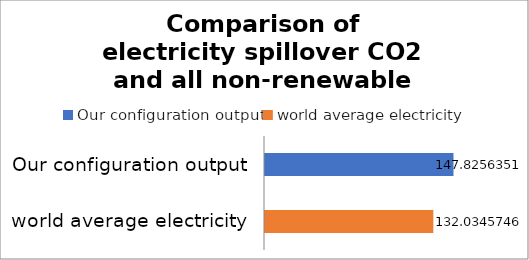
| Category | Series 0 |
|---|---|
| Our configuration output | 147.826 |
| world average electricity | 132.035 |